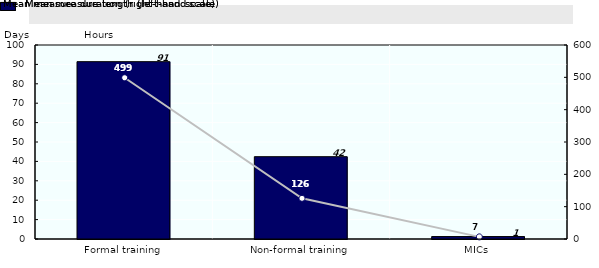
| Category | Mean measure length (left-hand scale) |
|---|---|
| Formal training | 91.41 |
| Non-formal training | 42.43 |
| MICs | 1.26 |